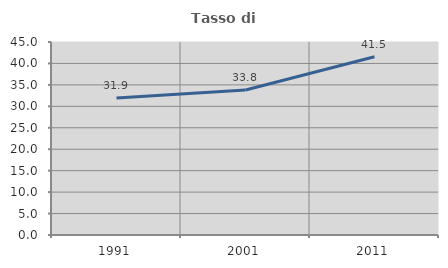
| Category | Tasso di occupazione   |
|---|---|
| 1991.0 | 31.932 |
| 2001.0 | 33.826 |
| 2011.0 | 41.546 |